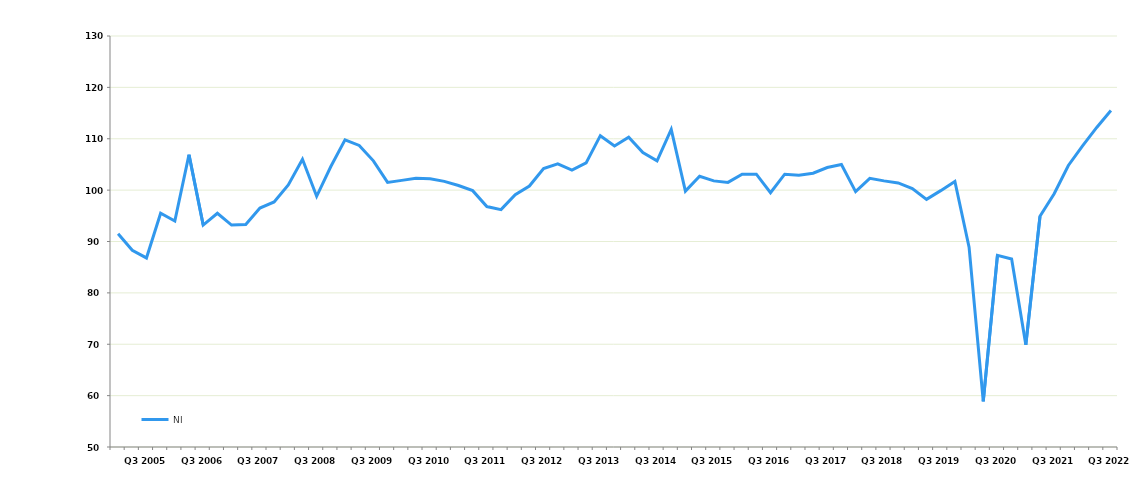
| Category | NI |
|---|---|
|  | 91.5 |
|  | 88.3 |
| Q3 2005 | 86.8 |
|  | 95.5 |
|  | 94 |
|  | 106.9 |
| Q3 2006 | 93.2 |
|  | 95.5 |
|  | 93.2 |
|  | 93.3 |
| Q3 2007 | 96.5 |
|  | 97.7 |
|  | 101 |
|  | 106 |
| Q3 2008 | 98.8 |
|  | 104.6 |
|  | 109.8 |
|  | 108.7 |
| Q3 2009 | 105.7 |
|  | 101.5 |
|  | 101.9 |
|  | 102.3 |
| Q3 2010 | 102.2 |
|  | 101.7 |
|  | 100.9 |
|  | 99.9 |
| Q3 2011 | 96.8 |
|  | 96.2 |
|  | 99.1 |
|  | 100.8 |
| Q3 2012 | 104.2 |
|  | 105.1 |
|  | 103.9 |
|  | 105.3 |
| Q3 2013 | 110.6 |
|  | 108.6 |
|  | 110.3 |
|  | 107.3 |
| Q3 2014 | 105.7 |
|  | 111.8 |
|  | 99.8 |
|  | 102.7 |
| Q3 2015 | 101.8 |
|  | 101.5 |
|  | 103.1 |
|  | 103.1 |
| Q3 2016 | 99.5 |
|  | 103.1 |
|  | 102.9 |
|  | 103.3 |
| Q3 2017 | 104.4 |
|  | 105 |
|  | 99.7 |
|  | 102.3 |
| Q3 2018 | 101.8 |
|  | 101.4 |
|  | 100.3 |
|  | 98.2 |
| Q3 2019 | 99.9 |
|  | 101.7 |
|  | 88.9 |
|  | 58.9 |
| Q3 2020 | 87.3 |
|  | 86.6 |
|  | 69.9 |
|  | 94.9 |
| Q3 2021 | 99.3 |
|  | 104.8 |
|  | 108.6 |
|  | 112.2 |
| Q3 2022 | 115.5 |